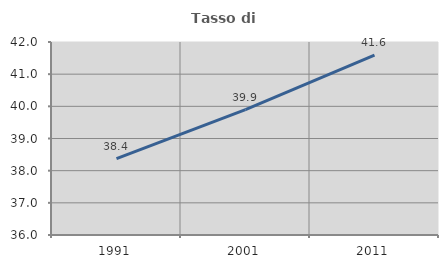
| Category | Tasso di occupazione   |
|---|---|
| 1991.0 | 38.377 |
| 2001.0 | 39.899 |
| 2011.0 | 41.589 |